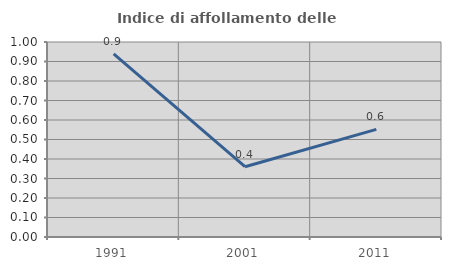
| Category | Indice di affollamento delle abitazioni  |
|---|---|
| 1991.0 | 0.94 |
| 2001.0 | 0.361 |
| 2011.0 | 0.552 |